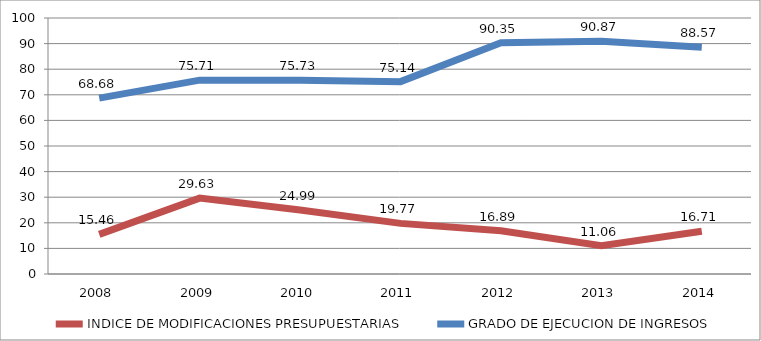
| Category | INDICE DE MODIFICACIONES PRESUPUESTARIAS | GRADO DE EJECUCION DE INGRESOS |
|---|---|---|
| 2008.0 | 15.465 | 68.683 |
| 2009.0 | 29.632 | 75.713 |
| 2010.0 | 24.986 | 75.729 |
| 2011.0 | 19.77 | 75.141 |
| 2012.0 | 16.887 | 90.35 |
| 2013.0 | 11.056 | 90.869 |
| 2014.0 | 16.708 | 88.568 |